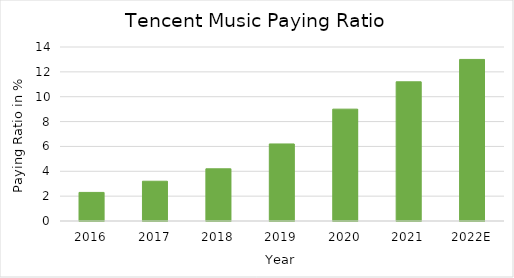
| Category | Paying Ratio |
|---|---|
| 2016 | 2.3 |
| 2017 | 3.2 |
| 2018 | 4.2 |
| 2019 | 6.2 |
| 2020 | 9 |
| 2021 | 11.2 |
| 2022E | 13 |